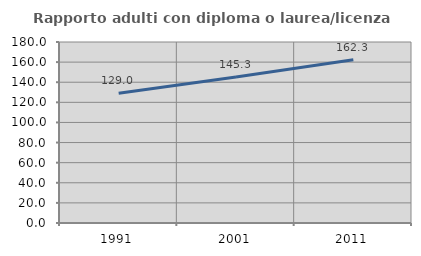
| Category | Rapporto adulti con diploma o laurea/licenza media  |
|---|---|
| 1991.0 | 129.008 |
| 2001.0 | 145.263 |
| 2011.0 | 162.295 |